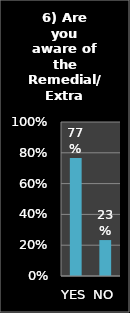
| Category | Series 0 |
|---|---|
| YES | 0.767 |
| NO | 0.233 |